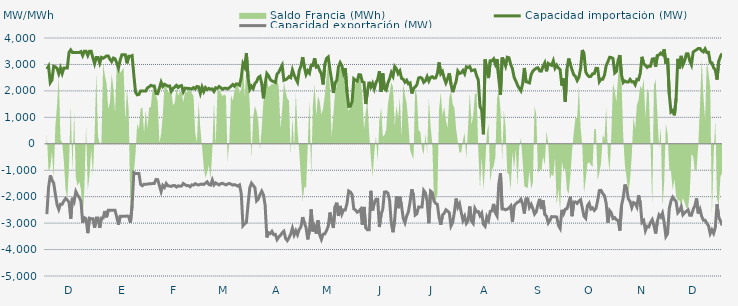
| Category | Capacidad importación (MW) | Capacidad exportación (MW) |
|---|---|---|
| 0 | 2825 | -2662.5 |
| 1900-01-01 | 2933.333 | -1658.333 |
| 1900-01-02 | 2312.5 | -1195.833 |
| 1900-01-03 | 2412.5 | -1375 |
| 1900-01-04 | 2933.333 | -1483.333 |
| 1900-01-05 | 2910.417 | -1912.5 |
| 1900-01-06 | 2850 | -2300 |
| 1900-01-07 | 2650 | -2483.333 |
| 1900-01-08 | 2866.667 | -2283.333 |
| 1900-01-09 | 2658.333 | -2283.333 |
| 1900-01-10 | 2866.667 | -2162.5 |
| 1900-01-11 | 2866.667 | -2066.667 |
| 1900-01-12 | 2866.667 | -2129.167 |
| 1900-01-13 | 3456.25 | -2204.167 |
| 1900-01-14 | 3550 | -2837.5 |
| 1900-01-15 | 3454.167 | -2041.667 |
| 1900-01-16 | 3454.167 | -2179.167 |
| 1900-01-17 | 3454.167 | -1808.333 |
| 1900-01-18 | 3454.167 | -1938.75 |
| 1900-01-19 | 3454.167 | -2029.167 |
| 1900-01-20 | 3487.5 | -2175 |
| 1900-01-21 | 3337.5 | -2983.333 |
| 1900-01-22 | 3500 | -2791.667 |
| 1900-01-23 | 3500 | -2833.333 |
| 1900-01-24 | 3337.5 | -3379.167 |
| 1900-01-25 | 3500 | -2812.5 |
| 1900-01-26 | 3500 | -2833.333 |
| 1900-01-27 | 3250 | -2837.5 |
| 1900-01-28 | 3028.25 | -3181.25 |
| 1900-01-29 | 3266.667 | -2808.333 |
| 1900-01-30 | 3266.667 | -2808.333 |
| 1900-01-31 | 3050 | -3181.25 |
| 1900-02-01 | 3266.667 | -2808.333 |
| 1900-02-02 | 3233.333 | -2808.333 |
| 1900-02-03 | 3275 | -2543.75 |
| 1900-02-04 | 3320.833 | -2779.167 |
| 1900-02-05 | 3320.833 | -2516.667 |
| 1900-02-06 | 3195.833 | -2516.667 |
| 1900-02-07 | 3108.333 | -2516.667 |
| 1900-02-08 | 3241.667 | -2516.667 |
| 1900-02-09 | 3212.5 | -2516.667 |
| 1900-02-10 | 3054.167 | -2775 |
| 1900-02-11 | 2862.5 | -3058.333 |
| 1900-02-12 | 3162.5 | -2741.667 |
| 1900-02-13 | 3366.667 | -2741.667 |
| 1900-02-14 | 3366.667 | -2741.667 |
| 1900-02-15 | 3366.667 | -2741.667 |
| 1900-02-16 | 3041.667 | -2729.167 |
| 1900-02-17 | 3306.25 | -2750 |
| 1900-02-18 | 3306.25 | -2991.667 |
| 1900-02-19 | 3333.333 | -2337.5 |
| 1900-02-20 | 2602.083 | -1083.333 |
| 1900-02-21 | 1950 | -1125 |
| 1900-02-22 | 1850 | -1125 |
| 1900-02-23 | 1866.667 | -1125 |
| 1900-02-24 | 2000 | -1537.5 |
| 1900-02-25 | 2000 | -1587.5 |
| 1900-02-26 | 2000 | -1529.167 |
| 1900-02-27 | 2000 | -1529.167 |
| 1900-02-28 | 2114.583 | -1525 |
| 1900-02-28 | 2154.167 | -1512.5 |
| 1900-03-01 | 2210.417 | -1516.667 |
| 1900-03-02 | 2183.333 | -1500 |
| 1900-03-03 | 2185.417 | -1500 |
| 1900-03-04 | 1906.25 | -1350 |
| 1900-03-05 | 1893.75 | -1358.333 |
| 1900-03-06 | 2104.167 | -1579.167 |
| 1900-03-07 | 2328.375 | -1804.167 |
| 1900-03-08 | 2166.667 | -1572.917 |
| 1900-03-09 | 2250 | -1650 |
| 1900-03-10 | 2212.5 | -1502.083 |
| 1900-03-11 | 2179.167 | -1589.583 |
| 1900-03-12 | 2187.5 | -1600 |
| 1900-03-13 | 1987.5 | -1612.5 |
| 1900-03-14 | 2091.667 | -1581.25 |
| 1900-03-15 | 2147.917 | -1581.25 |
| 1900-03-16 | 2208.333 | -1635.417 |
| 1900-03-17 | 2127.083 | -1589.583 |
| 1900-03-18 | 2185.417 | -1604.167 |
| 1900-03-19 | 2200 | -1597.917 |
| 1900-03-20 | 1966.667 | -1500 |
| 1900-03-21 | 2104.167 | -1545.833 |
| 1900-03-22 | 2102.083 | -1583.333 |
| 1900-03-23 | 2089.583 | -1581.25 |
| 1900-03-24 | 2085.417 | -1627.083 |
| 1900-03-25 | 2075 | -1554.167 |
| 1900-03-26 | 2122.917 | -1562.5 |
| 1900-03-27 | 2072.917 | -1508.333 |
| 1900-03-28 | 2166.667 | -1539.583 |
| 1900-03-29 | 2152.083 | -1560.417 |
| 1900-03-30 | 1908.333 | -1531.25 |
| 1900-03-31 | 2145.833 | -1525 |
| 1900-04-01 | 1972.917 | -1539.583 |
| 1900-04-02 | 2125 | -1491.667 |
| 1900-04-03 | 2050 | -1437.5 |
| 1900-04-04 | 2095.833 | -1539.583 |
| 1900-04-05 | 2062.5 | -1562.5 |
| 1900-04-06 | 2075 | -1368.75 |
| 1900-04-07 | 1979.167 | -1556.25 |
| 1900-04-08 | 2116.667 | -1481.25 |
| 1900-04-09 | 2093.75 | -1516.667 |
| 1900-04-10 | 2164.583 | -1556.25 |
| 1900-04-11 | 2116.667 | -1508.333 |
| 1900-04-12 | 2060.417 | -1493.75 |
| 1900-04-13 | 2102.083 | -1525 |
| 1900-04-14 | 2100 | -1556.25 |
| 1900-04-15 | 2075 | -1520.833 |
| 1900-04-16 | 2118.75 | -1500 |
| 1900-04-17 | 2177.083 | -1529.167 |
| 1900-04-18 | 2239.583 | -1562.5 |
| 1900-04-19 | 2177.083 | -1543.75 |
| 1900-04-20 | 2262.5 | -1568.75 |
| 1900-04-21 | 2260.417 | -1602.083 |
| 1900-04-22 | 2214.583 | -1556.25 |
| 1900-04-23 | 2506.25 | -1879.583 |
| 1900-04-24 | 3029.083 | -3096.667 |
| 1900-04-25 | 2897.083 | -3021.292 |
| 1900-04-26 | 3432.292 | -2977.083 |
| 1900-04-27 | 2507.25 | -2284.333 |
| 1900-04-28 | 2060.87 | -1658.696 |
| 1900-04-29 | 2179.167 | -1489.583 |
| 1900-04-30 | 2087.5 | -1575 |
| 1900-05-01 | 2277.417 | -1660.417 |
| 1900-05-02 | 2351.25 | -2160.417 |
| 1900-05-03 | 2503.458 | -2091.667 |
| 1900-05-04 | 2550 | -1920.833 |
| 1900-05-05 | 2281.458 | -1791.667 |
| 1900-05-06 | 1718.75 | -1920.833 |
| 1900-05-07 | 2254.5 | -2322.583 |
| 1900-05-08 | 2658.208 | -3541.417 |
| 1900-05-09 | 2574.708 | -3362.292 |
| 1900-05-10 | 2431.25 | -3398.958 |
| 1900-05-11 | 2374.5 | -3312.25 |
| 1900-05-12 | 2351.333 | -3435.417 |
| 1900-05-13 | 2317.583 | -3426.125 |
| 1900-05-14 | 2635.542 | -3620.708 |
| 1900-05-15 | 2711.542 | -3524.292 |
| 1900-05-16 | 2845.917 | -3464.708 |
| 1900-05-17 | 2969.417 | -3364.5 |
| 1900-05-18 | 2400.667 | -3304.667 |
| 1900-05-19 | 2423.292 | -3576.333 |
| 1900-05-20 | 2466.583 | -3661.208 |
| 1900-05-21 | 2539.583 | -3559.167 |
| 1900-05-22 | 2499 | -3412.958 |
| 1900-05-23 | 2794.042 | -3192.833 |
| 1900-05-24 | 2600.917 | -3446.833 |
| 1900-05-25 | 2454.333 | -3287.042 |
| 1900-05-26 | 2327 | -3437.333 |
| 1900-05-27 | 2764.875 | -3237.25 |
| 1900-05-28 | 2938.333 | -3142.542 |
| 1900-05-29 | 3277.667 | -2773.208 |
| 1900-05-30 | 2901.792 | -2987.042 |
| 1900-05-31 | 2620.125 | -3170.125 |
| 1900-06-01 | 2763 | -3616.833 |
| 1900-06-02 | 2671.542 | -3275.667 |
| 1900-06-03 | 2975.208 | -2481.333 |
| 1900-06-04 | 2963.292 | -3314.083 |
| 1900-06-05 | 3237.125 | -3127.25 |
| 1900-06-06 | 2903.125 | -3401.25 |
| 1900-06-07 | 2943.875 | -2899.917 |
| 1900-06-08 | 2767.417 | -3439.375 |
| 1900-06-09 | 2641.75 | -3616.75 |
| 1900-06-10 | 2244.417 | -3416.167 |
| 1900-06-11 | 3003.875 | -3408.875 |
| 1900-06-12 | 3226.875 | -3283.375 |
| 1900-06-13 | 3282.292 | -3121.542 |
| 1900-06-14 | 2800 | -2600 |
| 1900-06-15 | 2416.667 | -2918.75 |
| 1900-06-16 | 1920.333 | -3184.333 |
| 1900-06-17 | 2307.917 | -2385.917 |
| 1900-06-18 | 2390.792 | -2227.542 |
| 1900-06-19 | 2911.125 | -2730 |
| 1900-06-20 | 3070.25 | -2350.458 |
| 1900-06-21 | 2956.667 | -2656.375 |
| 1900-06-22 | 2670.833 | -2500 |
| 1900-06-23 | 2854.167 | -2500 |
| 1900-06-24 | 1964.208 | -2255.75 |
| 1900-06-25 | 1414.583 | -1785.417 |
| 1900-06-26 | 1420.833 | -1825 |
| 1900-06-27 | 1591.667 | -1922.917 |
| 1900-06-28 | 2454.167 | -2465 |
| 1900-06-29 | 2398.083 | -2503.583 |
| 1900-06-30 | 2366.667 | -2588.042 |
| 1900-07-01 | 2613.333 | -2542.833 |
| 1900-07-02 | 2604.917 | -2471 |
| 1900-07-03 | 2348.667 | -3059.875 |
| 1900-07-04 | 2320.833 | -2387.5 |
| 1900-07-05 | 1502.083 | -3177.542 |
| 1900-07-06 | 1981.25 | -3254.458 |
| 1900-07-07 | 2343.208 | -3252.458 |
| 1900-07-08 | 2147.917 | -1780 |
| 1900-07-09 | 2287.5 | -2525 |
| 1900-07-10 | 2076.167 | -2245.833 |
| 1900-07-11 | 2310.167 | -2100 |
| 1900-07-12 | 2432.875 | -2100 |
| 1900-07-13 | 2745.667 | -3148.25 |
| 1900-07-14 | 1962.5 | -2676.167 |
| 1900-07-15 | 2660.917 | -2469.583 |
| 1900-07-16 | 2079.167 | -1827.083 |
| 1900-07-17 | 2027.083 | -1816.667 |
| 1900-07-18 | 2300 | -1864.583 |
| 1900-07-19 | 2462.5 | -2143.75 |
| 1900-07-20 | 2691.458 | -3018.958 |
| 1900-07-21 | 2552.792 | -3345.333 |
| 1900-07-22 | 2923.125 | -2854.917 |
| 1900-07-23 | 2833.042 | -1993.167 |
| 1900-07-24 | 2653.792 | -2436 |
| 1900-07-25 | 2753.958 | -1999.792 |
| 1900-07-26 | 2473.333 | -2362.833 |
| 1900-07-27 | 2441.667 | -2824.792 |
| 1900-07-28 | 2328.458 | -2988.458 |
| 1900-07-29 | 2403.5 | -2728.542 |
| 1900-07-30 | 2265.917 | -2574.25 |
| 1900-07-31 | 2301.833 | -2201.042 |
| 1900-08-01 | 1903.333 | -1720.833 |
| 1900-08-02 | 2094.667 | -1947.917 |
| 1900-08-03 | 2147.917 | -2694.292 |
| 1900-08-04 | 2232.083 | -2646 |
| 1900-08-05 | 2487.5 | -2387.5 |
| 1900-08-06 | 2512.5 | -2387.5 |
| 1900-08-07 | 2472.917 | -2387.5 |
| 1900-08-08 | 2322 | -1764.625 |
| 1900-08-09 | 2377.5 | -1853.5 |
| 1900-08-10 | 2540.458 | -2160.917 |
| 1900-08-11 | 2372.875 | -3004.125 |
| 1900-08-12 | 2508.625 | -1791.125 |
| 1900-08-13 | 2539.208 | -1849.75 |
| 1900-08-14 | 2483.208 | -2155.417 |
| 1900-08-15 | 2490.375 | -2256.75 |
| 1900-08-16 | 2658.333 | -2291.667 |
| 1900-08-17 | 3076.5 | -2786.667 |
| 1900-08-18 | 2645.958 | -3061.667 |
| 1900-08-19 | 2731.458 | -2699.25 |
| 1900-08-20 | 2480.417 | -2627.458 |
| 1900-08-21 | 2300.833 | -2495 |
| 1900-08-22 | 2461.958 | -2546.167 |
| 1900-08-23 | 2667.458 | -2604.875 |
| 1900-08-24 | 2250.333 | -3105.542 |
| 1900-08-25 | 1952.083 | -2970.875 |
| 1900-08-26 | 2172 | -2579.417 |
| 1900-08-27 | 2356.083 | -2071.833 |
| 1900-08-28 | 2750.708 | -2400.667 |
| 1900-08-29 | 2658.875 | -2268.083 |
| 1900-08-30 | 2681 | -2596.625 |
| 1900-08-31 | 2770.75 | -2898.375 |
| 1900-09-01 | 2648.75 | -2746.625 |
| 1900-09-02 | 2910.167 | -3009.083 |
| 1900-09-03 | 2888.542 | -2911.458 |
| 1900-09-04 | 2919.917 | -2370.542 |
| 1900-09-05 | 2763.333 | -2914.917 |
| 1900-09-06 | 2782.917 | -3008.083 |
| 1900-09-07 | 2795.542 | -2448.708 |
| 1900-09-08 | 2576.25 | -2572.292 |
| 1900-09-09 | 2415.583 | -2563.292 |
| 1900-09-10 | 1418.917 | -2723.958 |
| 1900-09-11 | 1264.583 | -2622.458 |
| 1900-09-12 | 358.333 | -3044.542 |
| 1900-09-13 | 3186.917 | -3120.333 |
| 1900-09-14 | 2791.875 | -2763.458 |
| 1900-09-15 | 2484.583 | -2895.958 |
| 1900-09-16 | 3137.583 | -2556.25 |
| 1900-09-17 | 3137.5 | -2540.875 |
| 1900-09-18 | 3211 | -2273.125 |
| 1900-09-19 | 3012.542 | -2608.417 |
| 1900-09-20 | 3204.542 | -2728.708 |
| 1900-09-21 | 2487.333 | -1541.875 |
| 1900-09-22 | 1853.333 | -1112.917 |
| 1900-09-23 | 3263.917 | -2468.833 |
| 1900-09-24 | 3130.375 | -2468.375 |
| 1900-09-25 | 2944.542 | -2498.083 |
| 1900-09-26 | 3271.625 | -2470.667 |
| 1900-09-27 | 3250.667 | -2433.5 |
| 1900-09-28 | 3002.292 | -2354.917 |
| 1900-09-29 | 2842.625 | -2955.417 |
| 1900-09-30 | 2513.542 | -2337.375 |
| 1900-10-01 | 2375 | -2269.958 |
| 1900-10-02 | 2218.75 | -2210.458 |
| 1900-10-03 | 2093.75 | -2184.542 |
| 1900-10-04 | 2002.083 | -2097.042 |
| 1900-10-05 | 2264.583 | -2273.583 |
| 1900-10-06 | 2866.875 | -2637 |
| 1900-10-07 | 2346.958 | -2079.75 |
| 1900-10-08 | 2329.625 | -2082.083 |
| 1900-10-09 | 2302.458 | -2405.417 |
| 1900-10-10 | 2617.333 | -2289.667 |
| 1900-10-11 | 2750.042 | -2452.833 |
| 1900-10-12 | 2809.125 | -2657.958 |
| 1900-10-13 | 2857.375 | -2569.75 |
| 1900-10-14 | 2876.833 | -2291.708 |
| 1900-10-15 | 2750.708 | -2082.833 |
| 1900-10-16 | 2747.333 | -2466.667 |
| 1900-10-17 | 2937.458 | -2144.25 |
| 1900-10-18 | 3062.458 | -2672.417 |
| 1900-10-19 | 2740.417 | -2737.792 |
| 1900-10-20 | 3040.542 | -2994.125 |
| 1900-10-21 | 2995.708 | -2899.083 |
| 1900-10-22 | 2964.458 | -2754.583 |
| 1900-10-23 | 3138.792 | -2763.917 |
| 1900-10-24 | 2861.083 | -2758.667 |
| 1900-10-25 | 2973.75 | -2769.708 |
| 1900-10-26 | 2865 | -3086.792 |
| 1900-10-27 | 2805.417 | -3199.875 |
| 1900-10-28 | 2200 | -2500 |
| 1900-10-29 | 2468.25 | -2649 |
| 1900-10-30 | 1587.5 | -2475 |
| 1900-10-31 | 2818.542 | -2455.458 |
| 1900-11-01 | 3225.708 | -2239.583 |
| 1900-11-02 | 3000 | -2000 |
| 1900-11-03 | 2791.958 | -2738.25 |
| 1900-11-04 | 2607.167 | -2198.667 |
| 1900-11-05 | 2547.125 | -2197 |
| 1900-11-06 | 2393.292 | -2255.25 |
| 1900-11-07 | 2516 | -2169.167 |
| 1900-11-08 | 2853.667 | -2114.625 |
| 1900-11-09 | 3545.458 | -2428.042 |
| 1900-11-10 | 3402.833 | -2737.792 |
| 1900-11-11 | 2716.792 | -2816.833 |
| 1900-11-12 | 2599.417 | -2338.083 |
| 1900-11-13 | 2539.208 | -2246.333 |
| 1900-11-14 | 2547.375 | -2467.5 |
| 1900-11-15 | 2645.583 | -2424.333 |
| 1900-11-16 | 2654.167 | -2520.833 |
| 1900-11-17 | 2852.417 | -2448.375 |
| 1900-11-18 | 2850 | -2144.833 |
| 1900-11-19 | 2350 | -1768.75 |
| 1900-11-20 | 2450 | -1762.5 |
| 1900-11-21 | 2441.667 | -1881.25 |
| 1900-11-22 | 2597.917 | -1964.583 |
| 1900-11-23 | 2954.167 | -2250 |
| 1900-11-24 | 3102.32 | -2983.84 |
| 1900-11-25 | 3270.125 | -2524.167 |
| 1900-11-26 | 3263.958 | -2613.375 |
| 1900-11-27 | 3221.25 | -2826.5 |
| 1900-11-28 | 2678.333 | -2792.5 |
| 1900-11-29 | 2739.75 | -2875.042 |
| 1900-11-30 | 3161.75 | -2895.917 |
| 1900-12-01 | 3353.167 | -3283.208 |
| 1900-12-02 | 2604.75 | -2336.125 |
| 1900-12-03 | 2316.667 | -2037.25 |
| 1900-12-04 | 2377.083 | -1541.667 |
| 1900-12-05 | 2335.417 | -1708.333 |
| 1900-12-06 | 2333.083 | -2087.5 |
| 1900-12-07 | 2432.958 | -2175.833 |
| 1900-12-08 | 2341.417 | -2411.458 |
| 1900-12-09 | 2350 | -2224.167 |
| 1900-12-10 | 2233.333 | -2255.875 |
| 1900-12-11 | 2436.333 | -2388.333 |
| 1900-12-12 | 2422.917 | -1949.75 |
| 1900-12-13 | 2664.167 | -2243.25 |
| 1900-12-14 | 3289.125 | -2974.875 |
| 1900-12-15 | 3022.042 | -2905.375 |
| 1900-12-16 | 2967.917 | -3281.292 |
| 1900-12-17 | 2888.083 | -3117.75 |
| 1900-12-18 | 2932.458 | -3142.792 |
| 1900-12-19 | 2934.917 | -2973.208 |
| 1900-12-20 | 3202.583 | -2869.458 |
| 1900-12-21 | 3215.75 | -3094.417 |
| 1900-12-22 | 2915.5 | -3393.375 |
| 1900-12-23 | 3338.625 | -2938.583 |
| 1900-12-24 | 3362.542 | -2687.333 |
| 1900-12-25 | 3428.958 | -2770.5 |
| 1900-12-26 | 3372 | -2622.5 |
| 1900-12-27 | 3574.375 | -2972.542 |
| 1900-12-28 | 3028.917 | -3504.875 |
| 1900-12-29 | 3239.167 | -3400.917 |
| 1900-12-30 | 1878.75 | -2447.25 |
| 1900-12-31 | 1204.167 | -2164.583 |
| 1901-01-01 | 1258.333 | -2018.75 |
| 1901-01-02 | 1077.083 | -2108.333 |
| 1901-01-03 | 1711.917 | -2183.333 |
| 1901-01-04 | 3210.167 | -2609.5 |
| 1901-01-05 | 2835.417 | -2533.333 |
| 1901-01-06 | 3323.833 | -2378.417 |
| 1901-01-07 | 2986.708 | -2684.958 |
| 1901-01-08 | 3136.75 | -2609.25 |
| 1901-01-09 | 3398.958 | -2552.333 |
| 1901-01-10 | 3404.708 | -2496.458 |
| 1901-01-11 | 3136.792 | -2703.625 |
| 1901-01-12 | 2984.417 | -2700 |
| 1901-01-13 | 3466.5 | -2483.792 |
| 1901-01-14 | 3518.5 | -2345.833 |
| 1901-01-15 | 3555.167 | -2067 |
| 1901-01-16 | 3605.208 | -2635.583 |
| 1901-01-17 | 3603.083 | -2480.625 |
| 1901-01-18 | 3517.167 | -2743.458 |
| 1901-01-19 | 3473.958 | -2890.375 |
| 1901-01-20 | 3587.875 | -2893.625 |
| 1901-01-21 | 3454.583 | -3000.667 |
| 1901-01-22 | 3456.875 | -3104.042 |
| 1901-01-23 | 3080.708 | -3395.083 |
| 1901-01-24 | 3059.792 | -3254.417 |
| 1901-01-25 | 2872.417 | -3385.667 |
| 1901-01-26 | 2791.792 | -3162.083 |
| 1901-01-27 | 2427.708 | -2287.5 |
| 1901-01-28 | 3123.125 | -2773 |
| 1901-01-29 | 3298.917 | -2914.542 |
| 1901-01-30 | 3420.292 | -3090.167 |